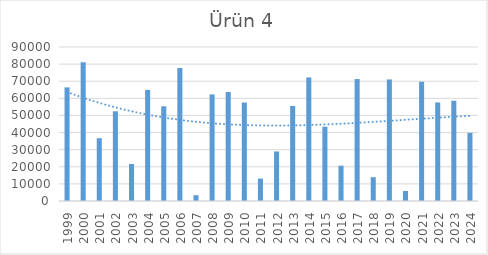
| Category | Ürün 4 |
|---|---|
| 1999.0 | 66392 |
| 2000.0 | 81042 |
| 2001.0 | 36700 |
| 2002.0 | 52434 |
| 2003.0 | 21640 |
| 2004.0 | 64955 |
| 2005.0 | 55343 |
| 2006.0 | 77751 |
| 2007.0 | 3365 |
| 2008.0 | 62305 |
| 2009.0 | 63694 |
| 2010.0 | 57537 |
| 2011.0 | 13102 |
| 2012.0 | 28953 |
| 2013.0 | 55527 |
| 2014.0 | 72213 |
| 2015.0 | 43433 |
| 2016.0 | 20651 |
| 2017.0 | 71267 |
| 2018.0 | 13904 |
| 2019.0 | 71044 |
| 2020.0 | 5853 |
| 2021.0 | 69690 |
| 2022.0 | 57590 |
| 2023.0 | 58591 |
| 2024.0 | 39818 |